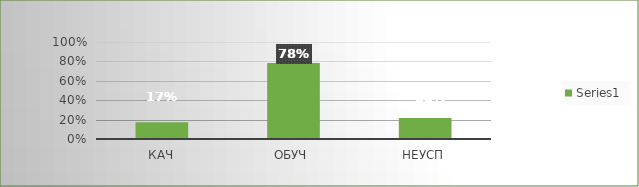
| Category | Series 0 |
|---|---|
| кач | 0.174 |
| обуч | 0.783 |
| неусп | 0.217 |